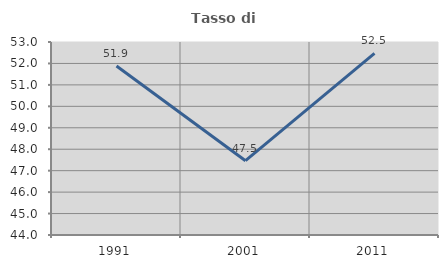
| Category | Tasso di occupazione   |
|---|---|
| 1991.0 | 51.88 |
| 2001.0 | 47.465 |
| 2011.0 | 52.466 |